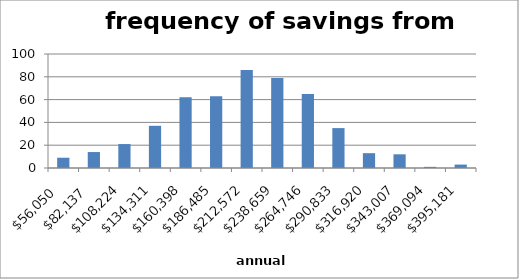
| Category | Series 0 |
|---|---|
| 56049.98748833779 | 9 |
| 82136.9642683264 | 14 |
| 108223.941048315 | 21 |
| 134310.9178283036 | 37 |
| 160397.89460829218 | 62 |
| 186484.87138828076 | 63 |
| 212571.84816826935 | 86 |
| 238658.82494825794 | 79 |
| 264745.80172824656 | 65 |
| 290832.7785082352 | 35 |
| 316919.7552882238 | 13 |
| 343006.7320682124 | 12 |
| 369093.70884820103 | 1 |
| 395180.6856281896 | 3 |